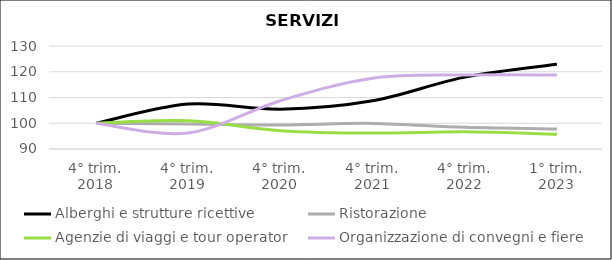
| Category | Alberghi e strutture ricettive | Ristorazione | Agenzie di viaggi e tour operator | Organizzazione di convegni e fiere |
|---|---|---|---|---|
| 4° trim.
2018 | 100 | 100 | 100 | 100 |
| 4° trim.
2019 | 107.463 | 99.728 | 100.957 | 96.25 |
| 4° trim.
2020 | 105.473 | 99.33 | 97.129 | 108.75 |
| 4° trim.
2021 | 108.706 | 99.946 | 96.172 | 117.5 |
| 4° trim.
2022 | 117.91 | 98.407 | 96.651 | 118.75 |
| 1° trim.
2023 | 122.886 | 97.809 | 95.694 | 118.75 |